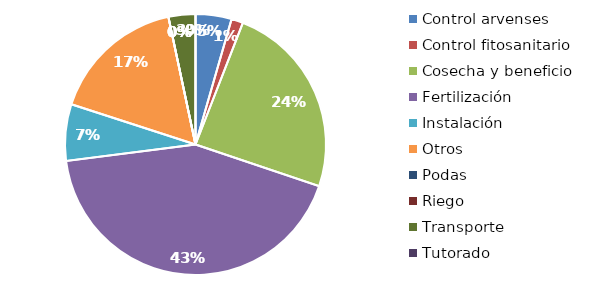
| Category | Valor |
|---|---|
| Control arvenses | 1561368 |
| Control fitosanitario | 507900 |
| Cosecha y beneficio | 8490140.845 |
| Fertilización | 14984336 |
| Instalación | 2451528.169 |
| Otros | 5836968 |
| Podas | 0 |
| Riego | 0 |
| Transporte | 1167392 |
| Tutorado | 0 |